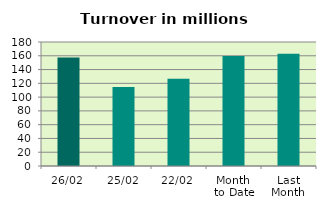
| Category | Series 0 |
|---|---|
| 26/02 | 157.52 |
| 25/02 | 114.608 |
| 22/02 | 126.583 |
| Month 
to Date | 159.602 |
| Last
Month | 163.101 |